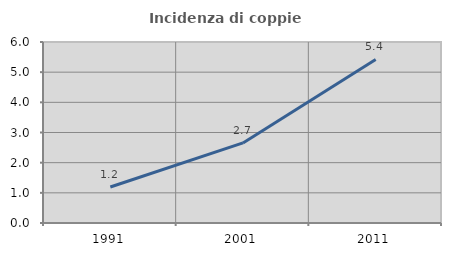
| Category | Incidenza di coppie miste |
|---|---|
| 1991.0 | 1.194 |
| 2001.0 | 2.655 |
| 2011.0 | 5.422 |